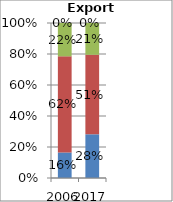
| Category | Other commercial services | Travel | Transport | Goods-related services |
|---|---|---|---|---|
| 2006.0 | 0.165 | 0.62 | 0.215 | 0 |
| 2017.0 | 0.282 | 0.513 | 0.205 | 0 |